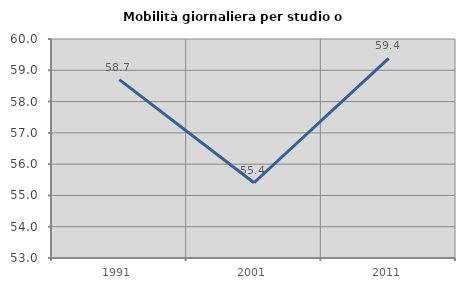
| Category | Mobilità giornaliera per studio o lavoro |
|---|---|
| 1991.0 | 58.703 |
| 2001.0 | 55.405 |
| 2011.0 | 59.383 |